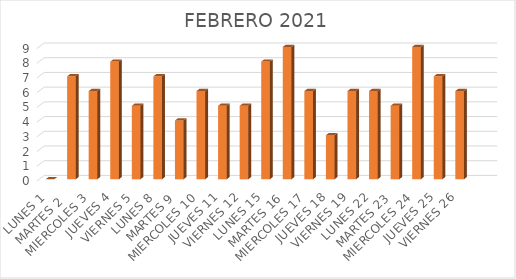
| Category | DIAS | PERSONAS ATENDIDAS | Series 1 |
|---|---|---|---|
| LUNES 1 |  |  | 0 |
| MARTES 2  |  |  | 7 |
| MIERCOLES 3 |  |  | 6 |
| JUEVES 4 |  |  | 8 |
| VIERNES 5 |  |  | 5 |
| LUNES 8 |  |  | 7 |
| MARTES 9 |  |  | 4 |
| MIERCOLES 10 |  |  | 6 |
| JUEVES 11 |  |  | 5 |
| VIERNES 12 |  |  | 5 |
| LUNES 15 |  |  | 8 |
| MARTES 16 |  |  | 9 |
| MIERCOLES 17 |  |  | 6 |
| JUEVES 18 |  |  | 3 |
| VIERNES 19 |  |  | 6 |
| LUNES 22 |  |  | 6 |
| MARTES 23 |  |  | 5 |
| MIERCOLES 24 |  |  | 9 |
| JUEVES 25 |  |  | 7 |
| VIERNES 26 |  |  | 6 |